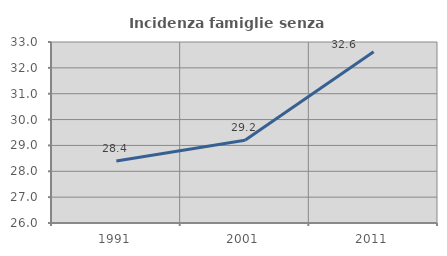
| Category | Incidenza famiglie senza nuclei |
|---|---|
| 1991.0 | 28.401 |
| 2001.0 | 29.198 |
| 2011.0 | 32.62 |